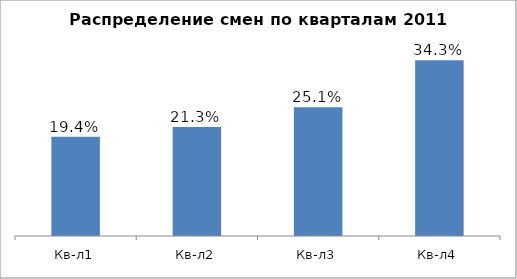
| Category | Итог |
|---|---|
| Кв-л1 | 0.194 |
| Кв-л2 | 0.213 |
| Кв-л3 | 0.251 |
| Кв-л4 | 0.343 |